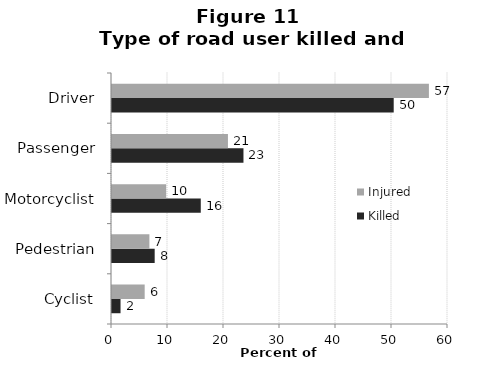
| Category | Killed | Injured |
|---|---|---|
| Cyclist | 1.524 | 5.837 |
| Pedestrian | 7.622 | 6.68 |
| Motorcyclist | 15.854 | 9.674 |
| Passenger | 23.476 | 20.705 |
| Driver | 50.305 | 56.591 |